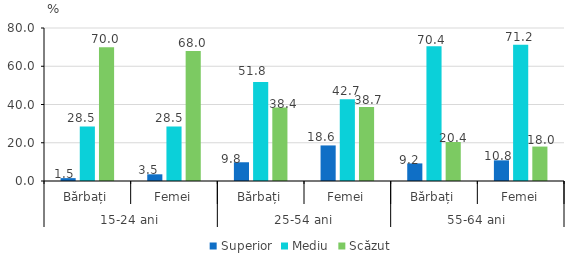
| Category | Superior | Mediu | Scăzut |
|---|---|---|---|
| 0 | 1.5 | 28.5 | 70 |
| 1 | 3.5 | 28.5 | 68 |
| 2 | 9.8 | 51.8 | 38.4 |
| 3 | 18.6 | 42.7 | 38.7 |
| 4 | 9.2 | 70.4 | 20.4 |
| 5 | 10.8 | 71.2 | 18 |